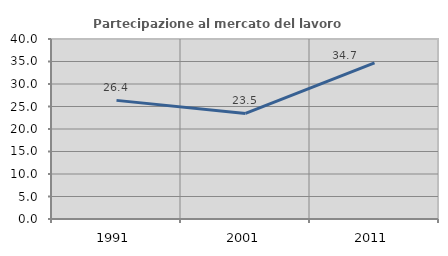
| Category | Partecipazione al mercato del lavoro  femminile |
|---|---|
| 1991.0 | 26.36 |
| 2001.0 | 23.467 |
| 2011.0 | 34.699 |